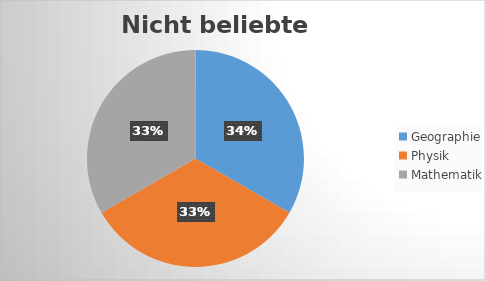
| Category | Series 0 |
|---|---|
| Geographie | 1 |
| Physik | 1 |
| Mathematik | 1 |